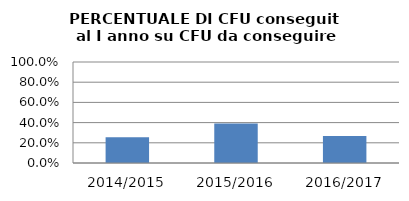
| Category | 2014/2015 2015/2016 2016/2017 |
|---|---|
| 2014/2015 | 0.255 |
| 2015/2016 | 0.391 |
| 2016/2017 | 0.268 |